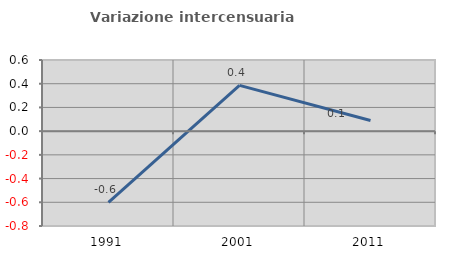
| Category | Variazione intercensuaria annua |
|---|---|
| 1991.0 | -0.601 |
| 2001.0 | 0.386 |
| 2011.0 | 0.09 |